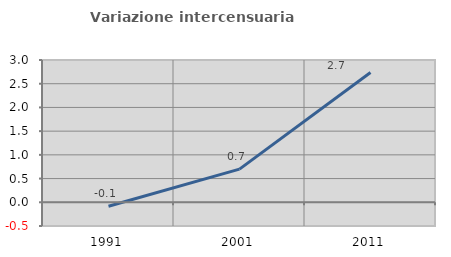
| Category | Variazione intercensuaria annua |
|---|---|
| 1991.0 | -0.085 |
| 2001.0 | 0.699 |
| 2011.0 | 2.736 |